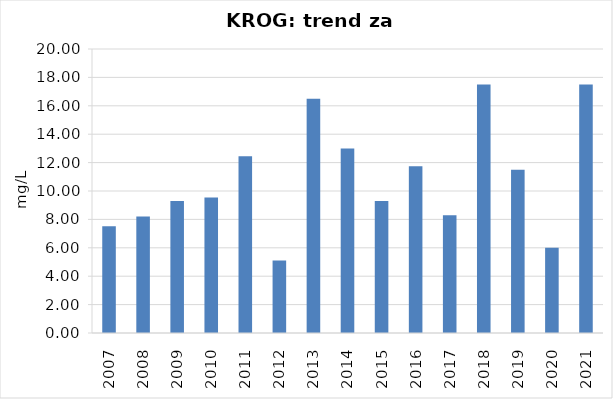
| Category | Vsota |
|---|---|
| 2007 | 7.525 |
| 2008 | 8.2 |
| 2009 | 9.3 |
| 2010 | 9.55 |
| 2011 | 12.45 |
| 2012 | 5.1 |
| 2013 | 16.5 |
| 2014 | 13 |
| 2015 | 9.3 |
| 2016 | 11.75 |
| 2017 | 8.3 |
| 2018 | 17.5 |
| 2019 | 11.5 |
| 2020 | 6 |
| 2021 | 17.5 |